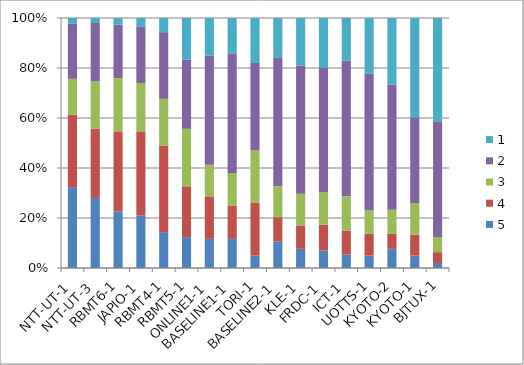
| Category | 5 | 4 | 3 | 2 | 1 |
|---|---|---|---|---|---|
| NTT-UT-1 | 97 | 87 | 43 | 66 | 7 |
| NTT-UT-3 | 84 | 83 | 57 | 70 | 6 |
| RBMT6-1 | 68 | 96 | 64 | 64 | 8 |
| JAPIO-1 | 63 | 101 | 58 | 68 | 10 |
| RBMT4-1 | 43 | 104 | 56 | 80 | 17 |
| RBMT5-1 | 37 | 61 | 69 | 83 | 50 |
| ONLINE1-1 | 35 | 51 | 38 | 131 | 45 |
| BASELINE1-1 | 35 | 40 | 39 | 143 | 43 |
| TORI-1 | 15 | 63 | 63 | 105 | 54 |
| BASELINE2-1 | 32 | 29 | 37 | 154 | 48 |
| KLE-1 | 23 | 28 | 38 | 154 | 57 |
| FRDC-1 | 21 | 31 | 39 | 149 | 60 |
| ICT-1 | 16 | 29 | 41 | 163 | 51 |
| UOTTS-1 | 15 | 26 | 28 | 164 | 67 |
| KYOTO-2 | 23 | 18 | 29 | 150 | 80 |
| KYOTO-1 | 15 | 25 | 38 | 103 | 119 |
| BJTUX-1 | 6 | 13 | 18 | 139 | 124 |